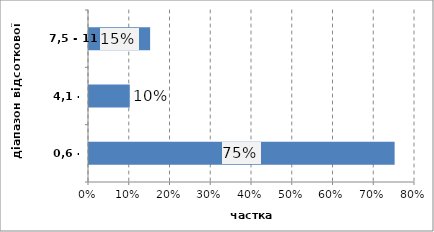
| Category | Series 0 |
|---|---|
| 0,6 - 4,1 | 0.75 |
| 4,1 - 7,5 | 0.1 |
| 7,5 - 11 | 0.15 |